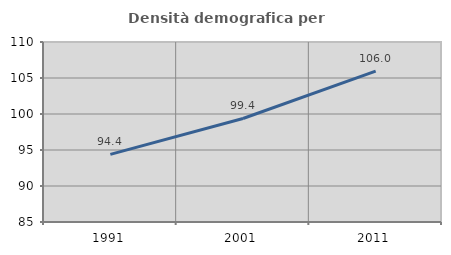
| Category | Densità demografica |
|---|---|
| 1991.0 | 94.391 |
| 2001.0 | 99.376 |
| 2011.0 | 105.96 |